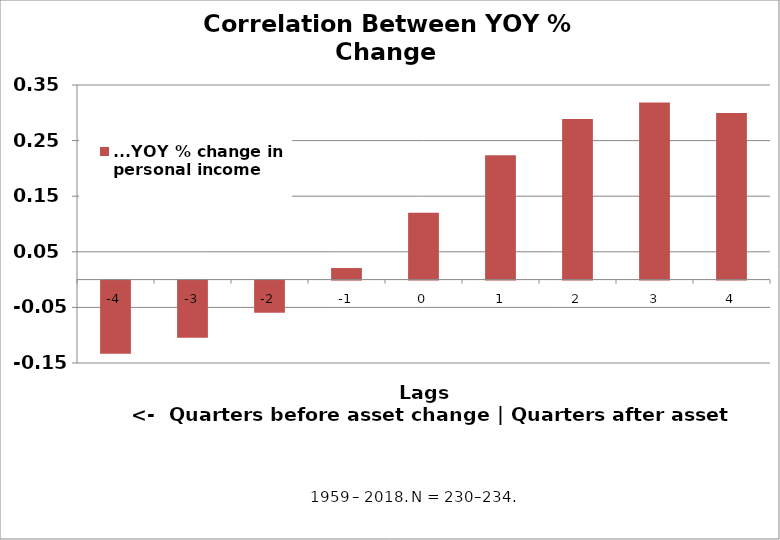
| Category | ...YOY % change in personal income |
|---|---|
| -4.0 | -0.131 |
| -3.0 | -0.103 |
| -2.0 | -0.058 |
| -1.0 | 0.021 |
| 0.0 | 0.12 |
| 1.0 | 0.224 |
| 2.0 | 0.289 |
| 3.0 | 0.319 |
| 4.0 | 0.3 |